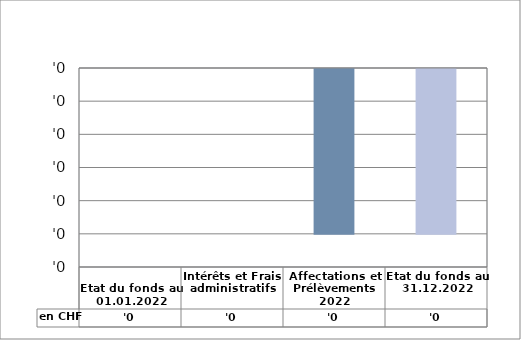
| Category | en CHF |
|---|---|
| 
Etat du fonds au 01.01.2022

 | 0 |
| Intérêts et Frais administratifs | 0 |
| Affectations et Prélèvements 2022 | -0.1 |
| Etat du fonds au 31.12.2022 | -0.1 |